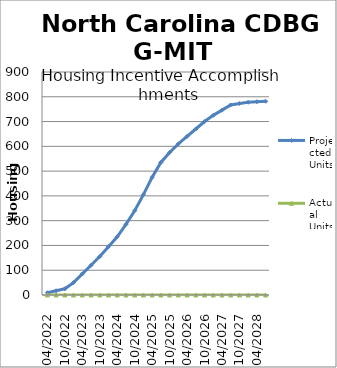
| Category | Projected Units | Actual Units |
|---|---|---|
| 04/2022 | 9 | 0 |
| 07/2022 | 17 | 0 |
| 10/2022 | 25 | 0 |
| 01/2023 | 50 | 0 |
| 04/2023 | 85 | 0 |
| 07/2023 | 120 | 0 |
| 10/2023 | 155 | 0 |
| 01/2024 | 195 | 0 |
| 04/2024 | 235 | 0 |
| 07/2024 | 285 | 0 |
| 10/2024 | 340 | 0 |
| 01/2025 | 405 | 0 |
| 04/2025 | 475 | 0 |
| 07/2025 | 535 | 0 |
| 10/2025 | 575 | 0 |
| 01/2026 | 610 | 0 |
| 04/2026 | 640 | 0 |
| 07/2026 | 670 | 0 |
| 10/2026 | 700 | 0 |
| 01/2027 | 725 | 0 |
| 04/2027 | 746 | 0 |
| 07/2027 | 767 | 0 |
| 10/2027 | 773 | 0 |
| 01/2028 | 778 | 0 |
| 04/2028 | 780 | 0 |
| 07/2028 | 782 | 0 |